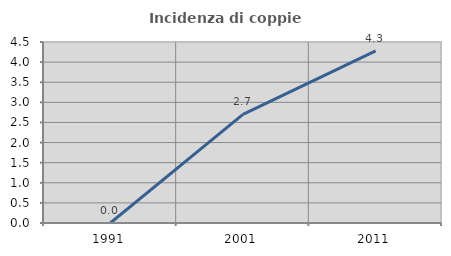
| Category | Incidenza di coppie miste |
|---|---|
| 1991.0 | 0 |
| 2001.0 | 2.703 |
| 2011.0 | 4.28 |